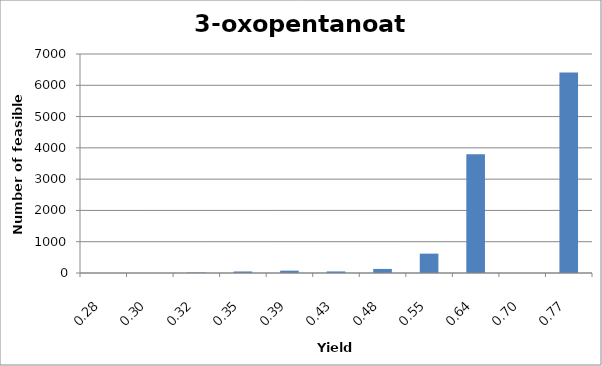
| Category | 3-oxopentanoate |
|---|---|
| 0.2762 | 1 |
| 0.2975 | 1 |
| 0.3223 | 15 |
| 0.3515 | 49 |
| 0.3867 | 75 |
| 0.4297 | 50 |
| 0.4834 | 130 |
| 0.5524 | 619 |
| 0.6445 | 3795 |
| 0.7031 | 1 |
| 0.7734 | 6409 |